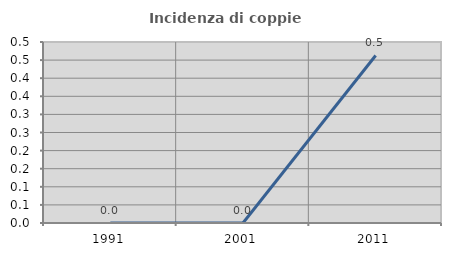
| Category | Incidenza di coppie miste |
|---|---|
| 1991.0 | 0 |
| 2001.0 | 0 |
| 2011.0 | 0.463 |